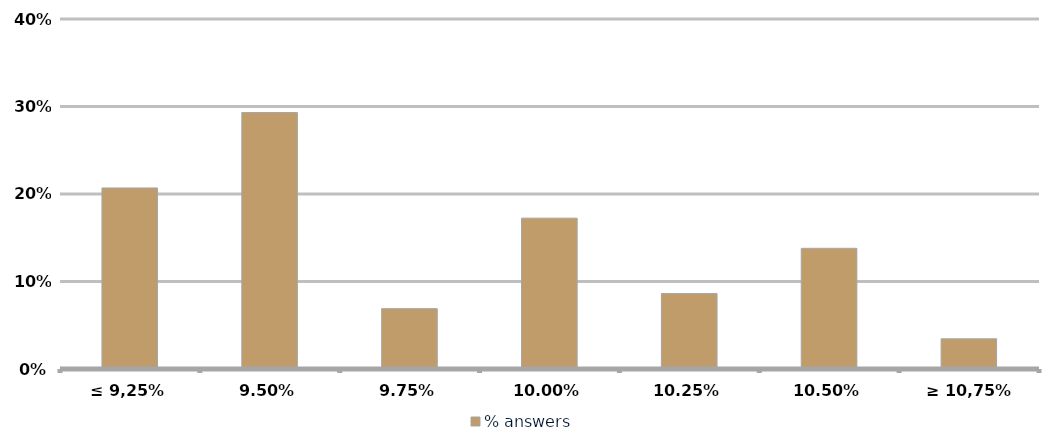
| Category | % answers |
|---|---|
| ≤ 9,25% | 0.207 |
| 9,50% | 0.293 |
| 9,75% | 0.069 |
| 10,00% | 0.172 |
| 10,25% | 0.086 |
| 10,50% | 0.138 |
| ≥ 10,75% | 0.034 |